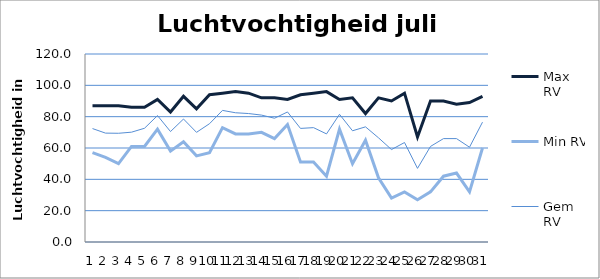
| Category | Max RV | Min RV | Gem RV |
|---|---|---|---|
| 0 | 87 | 57 | 72.4 |
| 1 | 87 | 54 | 69.5 |
| 2 | 87 | 50 | 69.4 |
| 3 | 86 | 61 | 70.1 |
| 4 | 86 | 61 | 72.6 |
| 5 | 91 | 72 | 80.7 |
| 6 | 83 | 58 | 70.5 |
| 7 | 93 | 64 | 78.5 |
| 8 | 85 | 55 | 70 |
| 9 | 94 | 57 | 75.5 |
| 10 | 95 | 73 | 84 |
| 11 | 96 | 69 | 82.5 |
| 12 | 95 | 69 | 82 |
| 13 | 92 | 70 | 81 |
| 14 | 92 | 66 | 79 |
| 15 | 91 | 75 | 83 |
| 16 | 94 | 51 | 72.5 |
| 17 | 95 | 51 | 73 |
| 18 | 96 | 42 | 69 |
| 19 | 91 | 72 | 81.5 |
| 20 | 92 | 50 | 71 |
| 21 | 82 | 65 | 73.5 |
| 22 | 92 | 41 | 66.5 |
| 23 | 90 | 28 | 59 |
| 24 | 95 | 32 | 63.5 |
| 25 | 67 | 27 | 47 |
| 26 | 90 | 32 | 61 |
| 27 | 90 | 42 | 66 |
| 28 | 88 | 44 | 66 |
| 29 | 89 | 32 | 60.5 |
| 30 | 93 | 60 | 76.5 |